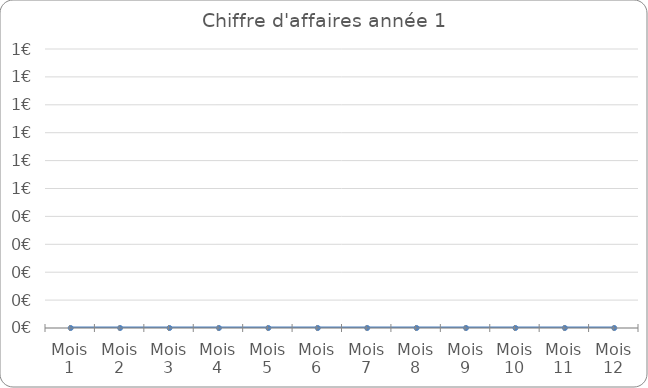
| Category | Chiffre d'affaires |
|---|---|
| Mois 1 | 0 |
| Mois 2 | 0 |
| Mois 3 | 0 |
| Mois 4 | 0 |
| Mois 5 | 0 |
| Mois 6 | 0 |
| Mois 7 | 0 |
| Mois 8 | 0 |
| Mois 9 | 0 |
| Mois 10 | 0 |
| Mois 11 | 0 |
| Mois 12 | 0 |